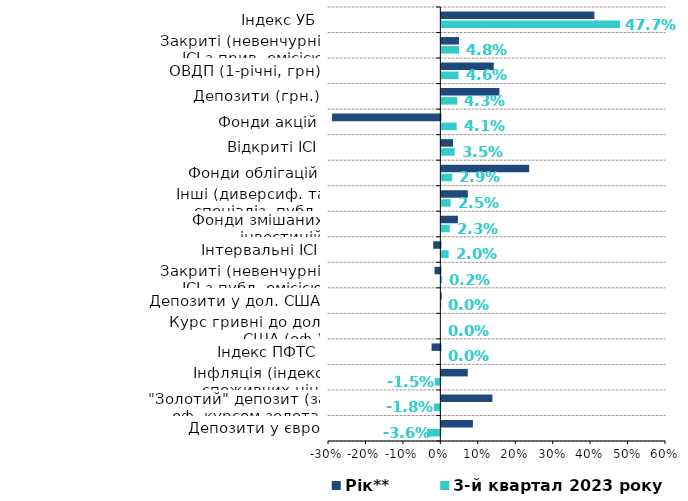
| Category | 3-й квартал 2023 року | З початку 2023 року | Рік** |
|---|---|---|---|
| Депозити у євро | -0.036 | -0.01 | 0.084 |
| "Золотий" депозит (за оф. курсом золота) | -0.018 | 0.039 | 0.136 |
| Інфляція (індекс споживчих цін) | -0.015 | 0.03 | 0.071 |
| Індекс ПФТС | 0 | -0.023 | -0.023 |
| Курс гривні до дол. США (оф.) | 0 | 0 | 0 |
| Депозити у дол. США | 0 | 0.001 | 0.001 |
| Закриті (невенчурні) ІСІ з публ. емісією | 0.002 | 0.054 | -0.015 |
| Інтервальні ІСІ | 0.02 | 0.011 | -0.019 |
| Фонди змішаних інвестицій | 0.023 | 0.055 | 0.044 |
| Інші (диверсиф. та спеціаліз. публ.) фонди | 0.025 | 0.104 | 0.071 |
| Фонди облігацій | 0.029 | 0.274 | 0.235 |
| Відкриті ІСІ | 0.035 | 0.052 | 0.031 |
| Фонди акцій | 0.041 | -0.233 | -0.289 |
| Депозити (грн.) | 0.043 | 0.12 | 0.155 |
| ОВДП (1-річні, грн) | 0.046 | 0.097 | 0.14 |
| Закриті (невенчурні) ІСІ з прив. емісією | 0.048 | 0.074 | 0.047 |
| Індекс УБ | 0.477 | 0.37 | 0.409 |